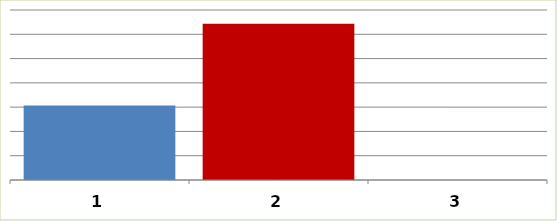
| Category | Series 0 |
|---|---|
| 0 | 61434787 |
| 1 | 128592913 |
| 2 | 0 |